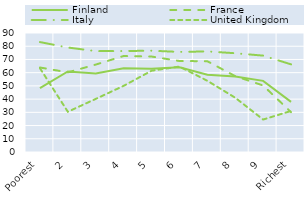
| Category | Finland | France | Italy | United Kingdom |
|---|---|---|---|---|
| Poorest | 48.27 | 63.92 | 83.14 | 63.36 |
| 2 | 60.96 | 60.25 | 79.02 | 30.43 |
| 3 | 59.29 | 66.12 | 76.3 | 40.15 |
| 4 | 63.33 | 72.6 | 76.34 | 50.04 |
| 5 | 62.91 | 72.2 | 76.63 | 61.46 |
| 6 | 64.15 | 68.81 | 75.68 | 64.62 |
| 7 | 58.5 | 68.65 | 76.07 | 53.87 |
| 8 | 57.1 | 57.34 | 74.69 | 41.04 |
| 9 | 53.79 | 50.3 | 72.89 | 24.55 |
| Richest | 37.91 | 30.14 | 66.28 | 31.05 |